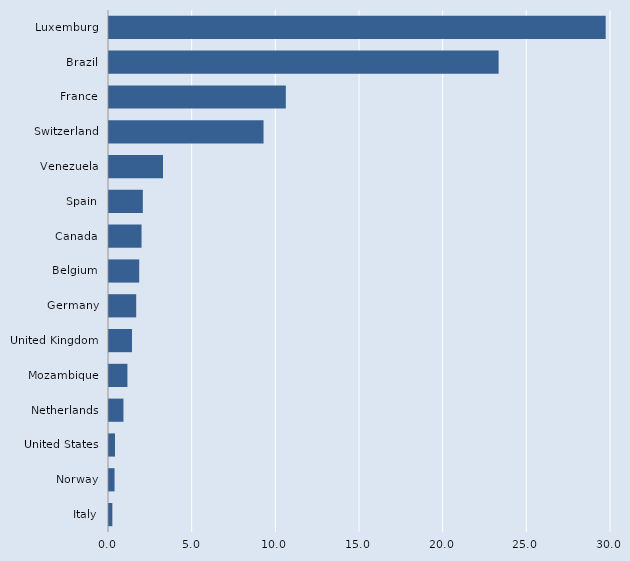
| Category | Series 0 |
|---|---|
| Italy | 0.2 |
| Norway | 0.332 |
| United States | 0.359 |
| Netherlands | 0.864 |
| Mozambique | 1.101 |
| United Kingdom | 1.375 |
| Germany | 1.626 |
| Belgium | 1.806 |
| Canada | 1.944 |
| Spain | 2.022 |
| Venezuela | 3.227 |
| Switzerland | 9.235 |
| France | 10.567 |
| Brazil | 23.284 |
| Luxemburg | 29.682 |